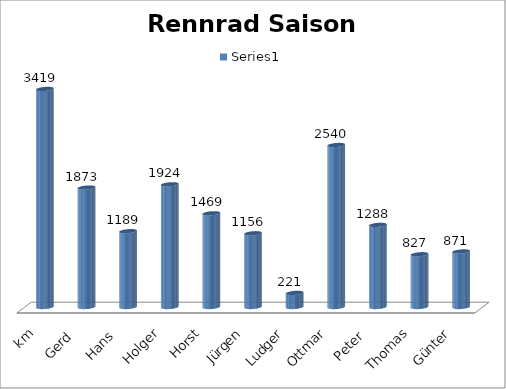
| Category | Series 0 |
|---|---|
| km | 3419 |
| Gerd  | 1873 |
| Hans  | 1189 |
| Holger | 1924 |
| Horst | 1469 |
| Jürgen | 1156 |
| Ludger | 221 |
| Ottmar  | 2540 |
| Peter  | 1288 |
| Thomas | 827 |
| Günter | 871 |